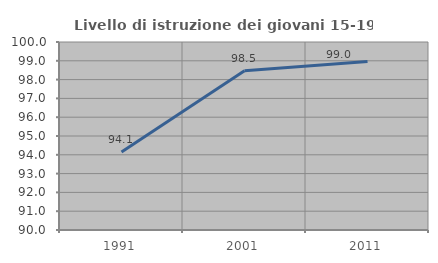
| Category | Livello di istruzione dei giovani 15-19 anni |
|---|---|
| 1991.0 | 94.149 |
| 2001.0 | 98.473 |
| 2011.0 | 98.966 |